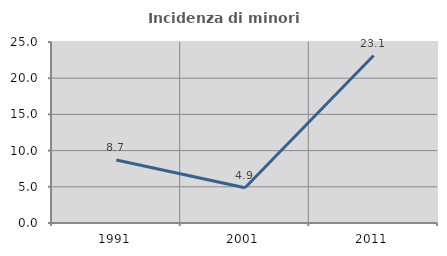
| Category | Incidenza di minori stranieri |
|---|---|
| 1991.0 | 8.696 |
| 2001.0 | 4.878 |
| 2011.0 | 23.125 |